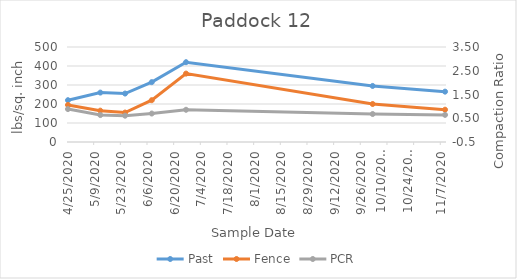
| Category | Past | Fence |
|---|---|---|
| 4/25/20 | 220 | 195 |
| 5/12/20 | 260 | 165 |
| 5/25/20 | 255 | 155 |
| 6/8/20 | 315 | 220 |
| 6/26/20 | 420 | 360 |
| 10/2/20 | 295 | 200 |
| 11/9/20 | 265 | 170 |